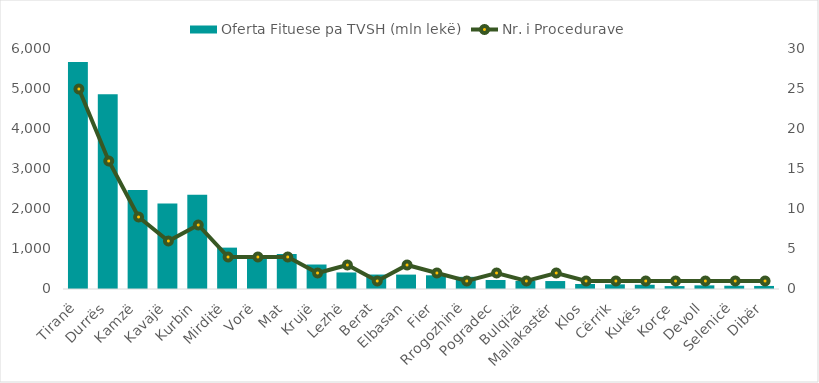
| Category | Oferta Fituese pa TVSH (mln lekë) |
|---|---|
| Tiranë | 5676.921 |
| Durrës | 4869.192 |
| Kamzë | 2476.441 |
| Kavajë | 2135.912 |
| Kurbin | 2355.125 |
| Mirditë | 1034.225 |
| Vorë | 768.78 |
| Mat | 874.75 |
| Krujë | 612.345 |
| Lezhë | 413.819 |
| Berat | 361.264 |
| Elbasan | 359.917 |
| Fier | 342.447 |
| Rrogozhinë | 304.164 |
| Pogradec | 224.611 |
| Bulqizë | 199.992 |
| Mallakastër | 198.917 |
| Klos | 125.066 |
| Cërrik | 116.056 |
| Kukës | 106.043 |
| Korçe | 73.074 |
| Devoll | 91.002 |
| Selenicë | 81.376 |
| Dibër | 76.387 |